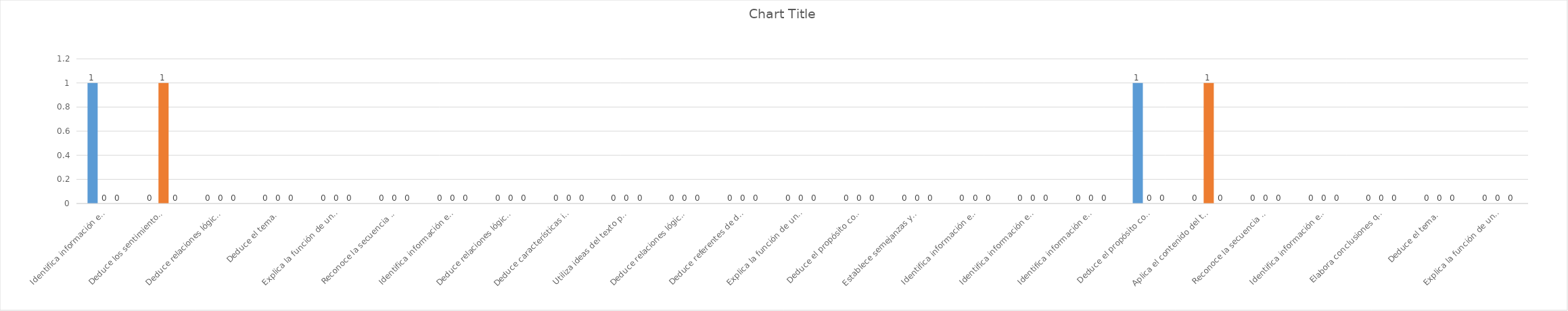
| Category | ADECUADAS | INADECUADAS | OMITIDAS |
|---|---|---|---|
| Identifica información explícita y relevante. | 1 | 0 | 0 |
| Deduce los sentimientos, emociones o estados de ánimo sugeridos por el texto. | 0 | 1 | 0 |
| Deduce relaciones lógicas de causa-efecto. | 0 | 0 | 0 |
| Deduce el tema. | 0 | 0 | 0 |
| Explica la función de una parte del texto en relación con el sentido global. | 0 | 0 | 0 |
| Reconoce la secuencia de hechos o acciones en un texto. | 0 | 0 | 0 |
| Identifica información explícita y relevante. | 0 | 0 | 0 |
| Deduce relaciones lógicas de causa-efecto. | 0 | 0 | 0 |
| Deduce características implícitas de personas, personajes, animales, objetos o lugares en un texto. | 0 | 0 | 0 |
| Utiliza ideas del texto para sustentar una opinión. | 0 | 0 | 0 |
| Deduce relaciones lógicas de causa-efecto. | 0 | 0 | 0 |
| Deduce referentes de distinto tipo. | 0 | 0 | 0 |
| Explica la función de una parte del texto en relación con el sentido global. | 0 | 0 | 0 |
| Deduce el propósito comunicativo de un texto. | 0 | 0 | 0 |
| Establece semejanzas y diferencias. | 0 | 0 | 0 |
| Identifica información explícita y relevante. | 0 | 0 | 0 |
| Identifica información explícita y relevante. | 0 | 0 | 0 |
| Identifica información explícita y relevante. | 0 | 0 | 0 |
| Deduce el propósito comunicativo de un texto. | 1 | 0 | 0 |
| Aplica el contenido del texto a otras situaciones. | 0 | 1 | 0 |
| Reconoce la secuencia de hechos o acciones en un texto. | 0 | 0 | 0 |
| Identifica información explícita y relevante. | 0 | 0 | 0 |
| Elabora conclusiones que se desprenden de hechos o afirmaciones del texto. | 0 | 0 | 0 |
| Deduce el tema. | 0 | 0 | 0 |
| Explica la función de una parte del texto en relación con el sentido global. | 0 | 0 | 0 |